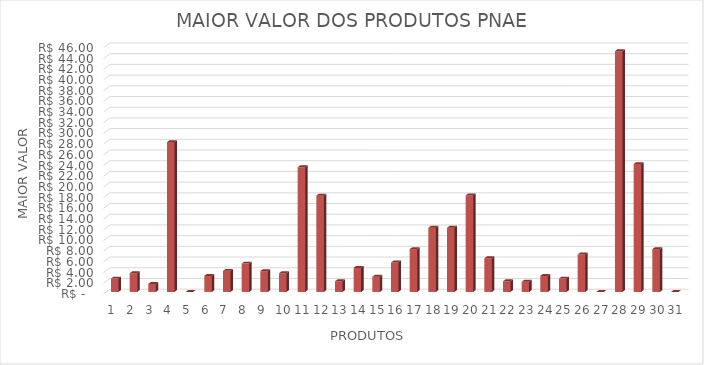
| Category | Series 0 |
|---|---|
| 0 | 2.5 |
| 1 | 3.5 |
| 2 | 1.5 |
| 3 | 28 |
| 4 | 0 |
| 5 | 3 |
| 6 | 3.95 |
| 7 | 5.3 |
| 8 | 3.9 |
| 9 | 3.5 |
| 10 | 23.3 |
| 11 | 18 |
| 12 | 2 |
| 13 | 4.5 |
| 14 | 2.85 |
| 15 | 5.5 |
| 16 | 8 |
| 17 | 12 |
| 18 | 12 |
| 19 | 18.05 |
| 20 | 6.3 |
| 21 | 2 |
| 22 | 1.9 |
| 23 | 3 |
| 24 | 2.5 |
| 25 | 7 |
| 26 | 0 |
| 27 | 45 |
| 28 | 23.9 |
| 29 | 8 |
| 30 | 0 |